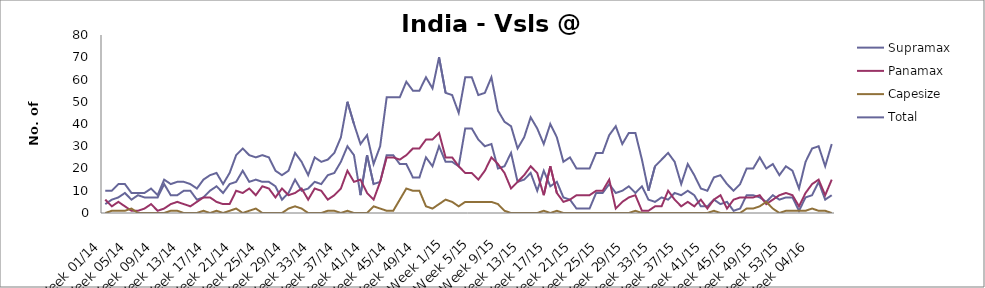
| Category | Supramax | Panamax | Capesize | Total |
|---|---|---|---|---|
| Week 01/14 | 4 | 6 | 0 | 10 |
| Week 02/14 | 6 | 3 | 1 | 10 |
| Week 03/14 | 7 | 5 | 1 | 13 |
| Week 04/14 | 9 | 3 | 1 | 13 |
| Week 05/14 | 6 | 1 | 2 | 9 |
| Week 06/14 | 8 | 1 | 0 | 9 |
| Week 07/14 | 7 | 2 | 0 | 9 |
| Week 08/14 | 7 | 4 | 0 | 11 |
| Week 09/14 | 7 | 1 | 0 | 8 |
| Week 10/14 | 13 | 2 | 0 | 15 |
| Week 11/14 | 8 | 4 | 1 | 13 |
| Week 12/14 | 8 | 5 | 1 | 14 |
| Week 13/14 | 10 | 4 | 0 | 14 |
| Week 14/14 | 10 | 3 | 0 | 13 |
| Week 15/14 | 6 | 5 | 0 | 11 |
| Week 16/14 | 7 | 7 | 1 | 15 |
| Week 17/14 | 10 | 7 | 0 | 17 |
| Week 18/14 | 12 | 5 | 1 | 18 |
| Week 19/14 | 9 | 4 | 0 | 13 |
| Week 20/14 | 13 | 4 | 1 | 18 |
| Week 21/14 | 14 | 10 | 2 | 26 |
| Week 22/14 | 19 | 9 | 0 | 29 |
| Week 23/14 | 14 | 11 | 1 | 26 |
| Week 24/14 | 15 | 8 | 2 | 25 |
| Week 25/14 | 14 | 12 | 0 | 26 |
| Week 26/14 | 14 | 11 | 0 | 25 |
| Week 27/14 | 12 | 7 | 0 | 19 |
| Week 28/14 | 6 | 11 | 0 | 17 |
| Week 29/14 | 9 | 8 | 2 | 19 |
| Week 30/14 | 15 | 9 | 3 | 27 |
| Week 31/14 | 10 | 11 | 2 | 23 |
| Week 32/14 | 11 | 6 | 0 | 17 |
| Week 33/14 | 14 | 11 | 0 | 25 |
| Week 34/14 | 13 | 10 | 0 | 23 |
| Week 35/14 | 17 | 6 | 1 | 24 |
| Week 36/14 | 18 | 8 | 1 | 27 |
| Week 37/14 | 23 | 11 | 0 | 34 |
| Week 38/14 | 30 | 19 | 1 | 50 |
| Week 39/14 | 26 | 14 | 0 | 40 |
| Week 40/14 | 8 | 15 | 0 | 31 |
| Week 41/14 | 26 | 9 | 0 | 35 |
| Week 42/14 | 13 | 6 | 3 | 22 |
| Week 43/14 | 14 | 14 | 2 | 30 |
| Week 44/14 | 26 | 25 | 1 | 52 |
| Week 45/14 | 26 | 25 | 1 | 52 |
| Week 46/14 | 22 | 24 | 6 | 52 |
| Week 47/14 | 22 | 26 | 11 | 59 |
| Week 48/14 | 16 | 29 | 10 | 55 |
| Week 49/14 | 16 | 29 | 10 | 55 |
| Week 50/14 | 25 | 33 | 3 | 61 |
| Week 51/14 | 21 | 33 | 2 | 56 |
| Week 52/14 | 30 | 36 | 4 | 70 |
| Week 1/15 | 23 | 25 | 6 | 54 |
| Week 2/15 | 23 | 25 | 5 | 53 |
| Week 3/15 | 21 | 21 | 3 | 45 |
| Week 4/15 | 38 | 18 | 5 | 61 |
| Week 5/15 | 38 | 18 | 5 | 61 |
| Week 6/15 | 33 | 15 | 5 | 53 |
| Week 7/15 | 30 | 19 | 5 | 54 |
| Week 8/15 | 31 | 25 | 5 | 61 |
| Week 9/15 | 20 | 22 | 4 | 46 |
| Week 10/15 | 21 | 18 | 1 | 41 |
| Week 11/15 | 27 | 11 | 0 | 39 |
| Week 12/15 | 14 | 14 | 0 | 29 |
| Week 13/15 | 15 | 17 | 0 | 34 |
| Week 14/15 | 18 | 21 | 0 | 43 |
| Week 15/15 | 10 | 18 | 0 | 38 |
| Week 16/15 | 19 | 8 | 1 | 31 |
| Week 17/15 | 12 | 21 | 0 | 40 |
| Week 18/15 | 14 | 9 | 1 | 34 |
| Week 19/15 | 7 | 5 | 0 | 23 |
| Week 20/15 | 6 | 6 | 0 | 25 |
| Week 21/15 | 2 | 8 | 0 | 20 |
| Week 22/15 | 2 | 8 | 0 | 20 |
| Week 23/15 | 2 | 8 | 0 | 20 |
| Week 24/15 | 9 | 10 | 0 | 27 |
| Week 25/15 | 9 | 10 | 0 | 27 |
| Week 26/15 | 13 | 15 | 0 | 35 |
| Week 27/15 | 9 | 2 | 0 | 39 |
| Week 28/15 | 10 | 5 | 0 | 31 |
| Week 29/15 | 12 | 7 | 0 | 36 |
| Week 30/15 | 9 | 8 | 1 | 36 |
| Week 31/15 | 12 | 1 | 0 | 24 |
| Week 32/15 | 6 | 1 | 0 | 10 |
| Week 33/15 | 5 | 3 | 0 | 21 |
| Week 34/15 | 7 | 3 | 0 | 24 |
| Week 35/15 | 6 | 10 | 0 | 27 |
| Week 36/15 | 9 | 6 | 0 | 23 |
| Week 37/15 | 8 | 3 | 0 | 13 |
| Week 38/15 | 10 | 5 | 0 | 22 |
| Week 39/15 | 8 | 3 | 0 | 17 |
| Week 40/15 | 3 | 6 | 0 | 11 |
| Week 41/15 | 3 | 2 | 0 | 10 |
| Week 42/15 | 6 | 6 | 1 | 16 |
| Week 43/15 | 4 | 8 | 0 | 17 |
| Week 44/15 | 5 | 2 | 0 | 13 |
| Week 45/15 | 1 | 6 | 0 | 10 |
| Week 46/15 | 2 | 7 | 0 | 13 |
| Week 47/15 | 8 | 7 | 2 | 20 |
| Week 48/15 | 8 | 7 | 2 | 20 |
| Week 49/15 | 7 | 8 | 3 | 25 |
| Week 50/15 | 5 | 4 | 5 | 20 |
| Week 51/15 | 8 | 6 | 2 | 22 |
| Week 52/15 | 6 | 8 | 0 | 17 |
| Week 53/15 | 7 | 9 | 1 | 21 |
| Week 01/16 | 7 | 8 | 1 | 19 |
| Week 02/16 | 1 | 3 | 1 | 11 |
| Week 03/16 | 7 | 9 | 1 | 23 |
| Week 04/16 | 8 | 13 | 2 | 29 |
| Week 05/16 | 14 | 15 | 1 | 30 |
| Week 06/16 | 6 | 8 | 1 | 21 |
| Week 07/16 | 8 | 15 | 0 | 31 |